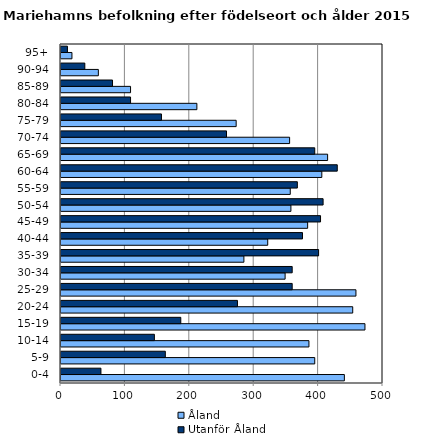
| Category | Åland | Utanför Åland |
|---|---|---|
| 0-4 | 440 | 62 |
| 5-9 | 394 | 162 |
| 10-14 | 385 | 145 |
| 15-19 | 472 | 186 |
| 20-24 | 453 | 274 |
| 25-29 | 458 | 359 |
| 30-34 | 348 | 359 |
| 35-39 | 284 | 400 |
| 40-44 | 321 | 375 |
| 45-49 | 383 | 403 |
| 50-54 | 357 | 407 |
| 55-59 | 356 | 367 |
| 60-64 | 405 | 429 |
| 65-69 | 414 | 394 |
| 70-74 | 355 | 257 |
| 75-79 | 272 | 156 |
| 80-84 | 211 | 108 |
| 85-89 | 108 | 80 |
| 90-94 | 58 | 37 |
| 95+ | 17 | 10 |